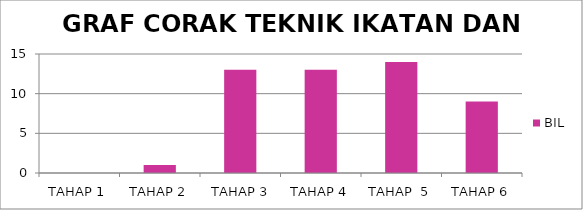
| Category | BIL |
|---|---|
| TAHAP 1 | 0 |
| TAHAP 2 | 1 |
|  TAHAP 3 | 13 |
| TAHAP 4 | 13 |
| TAHAP  5 | 14 |
| TAHAP 6 | 9 |